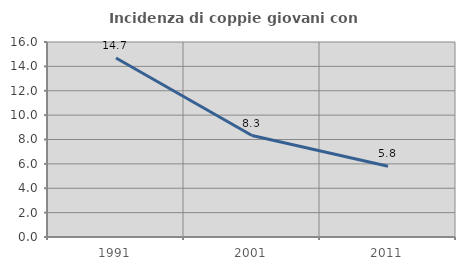
| Category | Incidenza di coppie giovani con figli |
|---|---|
| 1991.0 | 14.685 |
| 2001.0 | 8.323 |
| 2011.0 | 5.81 |